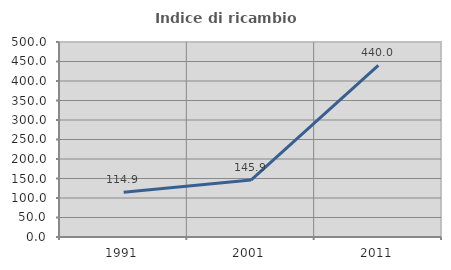
| Category | Indice di ricambio occupazionale  |
|---|---|
| 1991.0 | 114.894 |
| 2001.0 | 145.946 |
| 2011.0 | 440 |